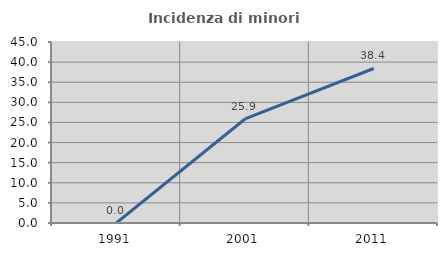
| Category | Incidenza di minori stranieri |
|---|---|
| 1991.0 | 0 |
| 2001.0 | 25.862 |
| 2011.0 | 38.415 |